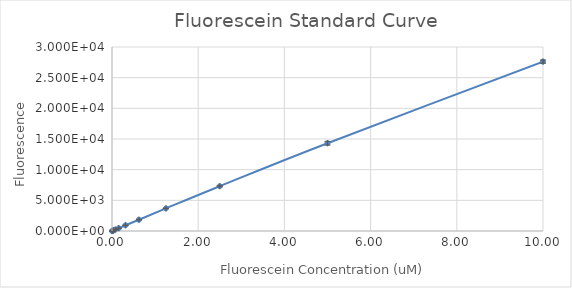
| Category | Series 0 |
|---|---|
| 10.0 | 27615 |
| 5.0 | 14312.5 |
| 2.5 | 7304.5 |
| 1.25 | 3686.75 |
| 0.625 | 1838.25 |
| 0.3125 | 930.5 |
| 0.15625 | 452 |
| 0.078125 | 231.25 |
| 0.0390625 | 116 |
| 0.01953125 | 58.5 |
| 0.009765625 | 26.25 |
| 0.0 | 5 |